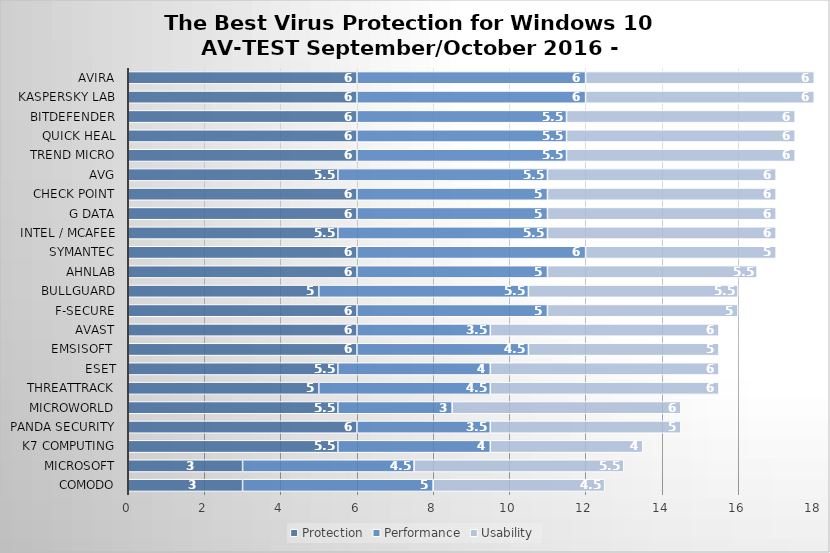
| Category | Protection | Performance | Usability |
|---|---|---|---|
| Comodo | 3 | 5 | 4.5 |
| Microsoft | 3 | 4.5 | 5.5 |
| K7 Computing | 5.5 | 4 | 4 |
| Panda Security | 6 | 3.5 | 5 |
| Microworld | 5.5 | 3 | 6 |
| ThreatTrack | 5 | 4.5 | 6 |
| ESET | 5.5 | 4 | 6 |
| Emsisoft  | 6 | 4.5 | 5 |
| Avast | 6 | 3.5 | 6 |
| F-Secure | 6 | 5 | 5 |
| BullGuard | 5 | 5.5 | 5.5 |
| AhnLab | 6 | 5 | 5.5 |
| Symantec | 6 | 6 | 5 |
| Intel / McAfee | 5.5 | 5.5 | 6 |
| G Data | 6 | 5 | 6 |
| Check Point | 6 | 5 | 6 |
| AVG | 5.5 | 5.5 | 6 |
| Trend Micro | 6 | 5.5 | 6 |
| Quick Heal | 6 | 5.5 | 6 |
| Bitdefender | 6 | 5.5 | 6 |
| Kaspersky Lab | 6 | 6 | 6 |
| Avira | 6 | 6 | 6 |